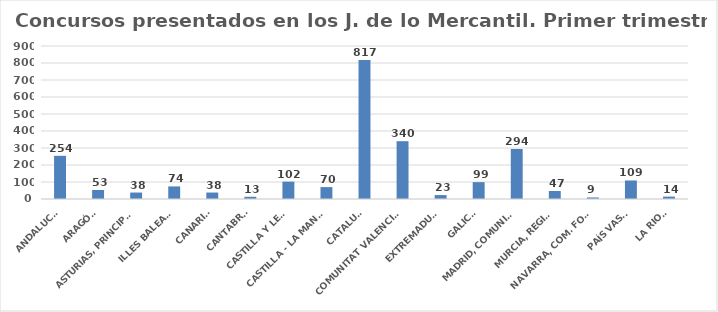
| Category | Series 0 |
|---|---|
| ANDALUCÍA | 254 |
| ARAGÓN | 53 |
| ASTURIAS, PRINCIPADO | 38 |
| ILLES BALEARS | 74 |
| CANARIAS | 38 |
| CANTABRIA | 13 |
| CASTILLA Y LEÓN | 102 |
| CASTILLA - LA MANCHA | 70 |
| CATALUÑA | 817 |
| COMUNITAT VALENCIANA | 340 |
| EXTREMADURA | 23 |
| GALICIA | 99 |
| MADRID, COMUNIDAD | 294 |
| MURCIA, REGIÓN | 47 |
| NAVARRA, COM. FORAL | 9 |
| PAÍS VASCO | 109 |
| LA RIOJA | 14 |